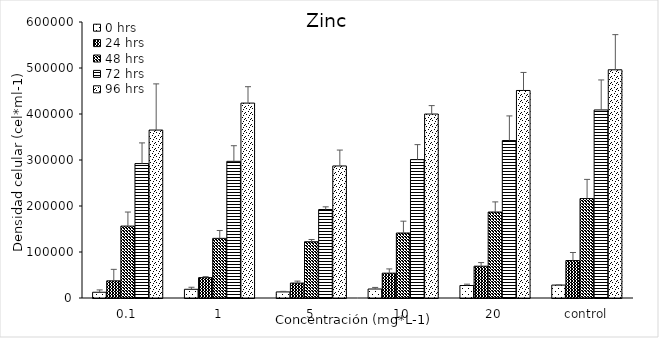
| Category | 0 hrs | 24 hrs | 48 hrs | 72 hrs | 96 hrs |
|---|---|---|---|---|---|
| 0,1 | 12468.633 | 37326.189 | 156287.185 | 292235.785 | 365102.048 |
| 1 | 18937.412 | 44262.836 | 129654.906 | 297105.373 | 423691.062 |
| 5 | 13219.752 | 32422.362 | 122273.572 | 192345.622 | 287027.323 |
| 10 | 19552.399 | 54002.499 | 141245.828 | 300849.855 | 399882.704 |
| 20 | 27173.27 | 69145.483 | 186867.243 | 342317.354 | 451122.782 |
| control | 28076.482 | 81432.947 | 216191.044 | 408803.339 | 496103.008 |